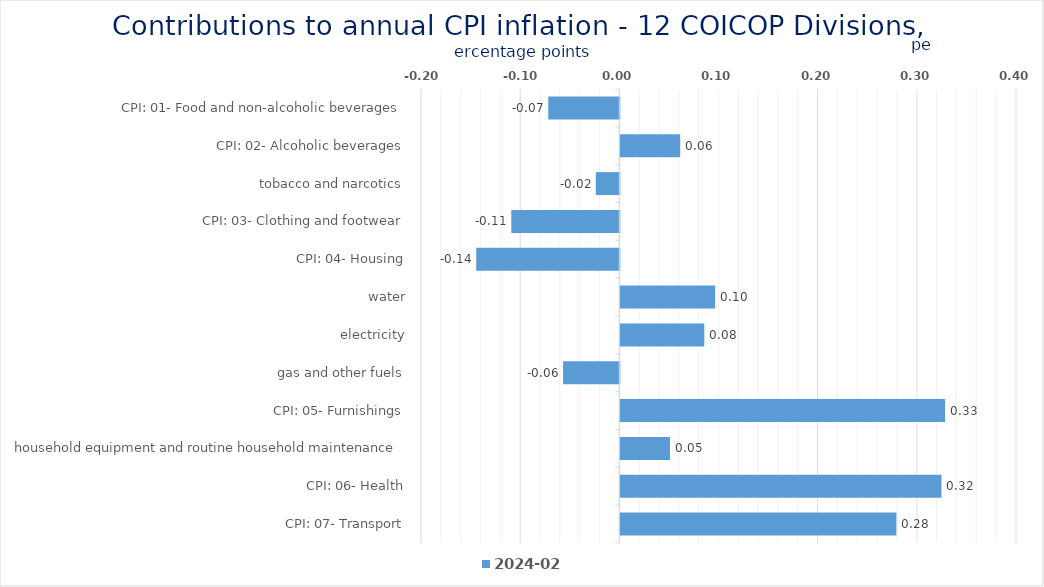
| Category | 2024-02 |
|---|---|
| CPI: 01- Food and non-alcoholic beverages | -0.072 |
| CPI: 02- Alcoholic beverages, tobacco and narcotics | 0.06 |
| CPI: 03- Clothing and footwear | -0.024 |
| CPI: 04- Housing, water, electricity, gas and other fuels | -0.109 |
| CPI: 05- Furnishings, household equipment and routine household maintenance | -0.144 |
| CPI: 06- Health | 0.096 |
| CPI: 07- Transport | 0.085 |
| CPI: 08- Communication | -0.057 |
| CPI: 09- Recreation and culture | 0.327 |
| CPI: 10- Education | 0.05 |
| CPI: 11- Restaurants and hotels | 0.324 |
| CPI: 12- Miscellaneous goods and services | 0.278 |